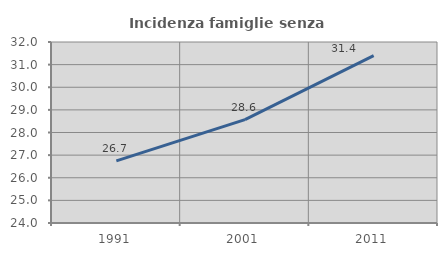
| Category | Incidenza famiglie senza nuclei |
|---|---|
| 1991.0 | 26.744 |
| 2001.0 | 28.571 |
| 2011.0 | 31.395 |